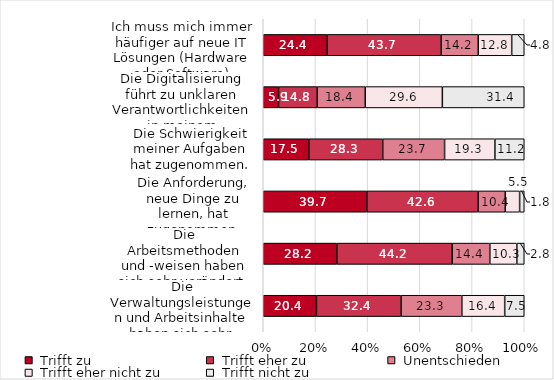
| Category | Series 0 | Series 1 | Series 2 | Series 3 | Series 4 |
|---|---|---|---|---|---|
| Ich muss mich immer häufiger auf neue IT Lösungen (Hardware oder Software) einstellen. | 24.449 | 43.687 | 14.228 | 12.826 | 4.81 |
| Die Digitalisierung führt zu unklaren Verantwortlichkeiten in meinem Arbeitsbereich. | 5.87 | 14.777 | 18.421 | 29.555 | 31.377 |
| Die Schwierigkeit meiner Aufgaben hat zugenommen. | 17.47 | 28.313 | 23.695 | 19.277 | 11.245 |
| Die Anforderung, neue Dinge zu lernen, hat zugenommen. | 39.686 | 42.633 | 10.413 | 5.501 | 1.768 |
| Die Arbeitsmethoden und -weisen haben sich sehr verändert. | 28.195 | 44.219 | 14.402 | 10.345 | 2.84 |
| Die Verwaltungsleistungen und Arbeitsinhalte haben sich sehr verändert. | 20.374 | 32.432 | 23.285 | 16.424 | 7.484 |